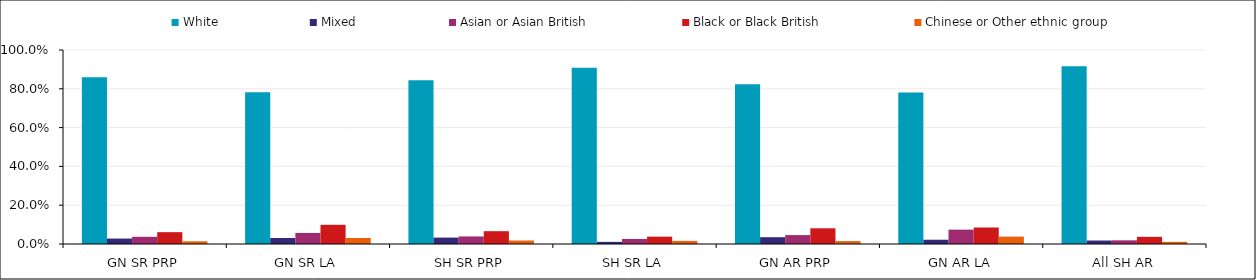
| Category | White | Mixed | Asian or Asian British | Black or Black British | Chinese or Other ethnic group |
|---|---|---|---|---|---|
| GN SR PRP | 0.86 | 0.028 | 0.037 | 0.061 | 0.014 |
| GN SR LA | 0.782 | 0.031 | 0.057 | 0.099 | 0.031 |
| SH SR PRP | 0.844 | 0.033 | 0.039 | 0.066 | 0.018 |
| SH SR LA | 0.909 | 0.011 | 0.026 | 0.038 | 0.016 |
| GN AR PRP | 0.823 | 0.035 | 0.046 | 0.081 | 0.015 |
| GN AR LA | 0.781 | 0.022 | 0.074 | 0.085 | 0.038 |
| All SH AR | 0.916 | 0.018 | 0.019 | 0.037 | 0.011 |